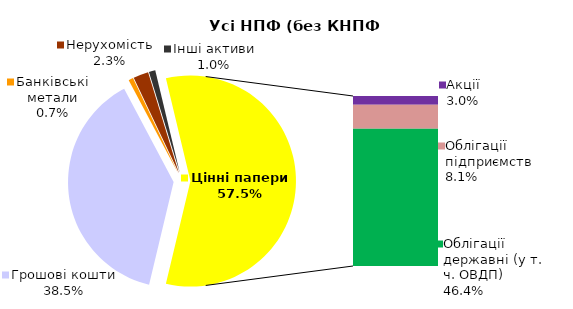
| Category | Усі НПФ (без КНПФ НБУ) |
|---|---|
| Грошові кошти | 525.169 |
| Банківські метали | 9.809 |
| Нерухомість | 31.721 |
| Інші активи | 13.441 |
| Акції | 40.296 |
| Облігації підприємств | 110.564 |
| Муніципальні облігації | 0 |
| Облігації державні (у т. ч. ОВДП) | 633.138 |